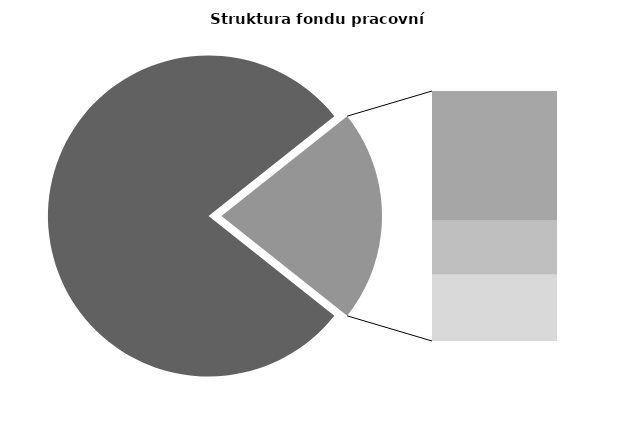
| Category | Series 0 |
|---|---|
| Průměrná měsíční odpracovaná doba bez přesčasu | 135.108 |
| Dovolená | 19.048 |
| Nemoc | 7.937 |
| Jiné | 9.718 |